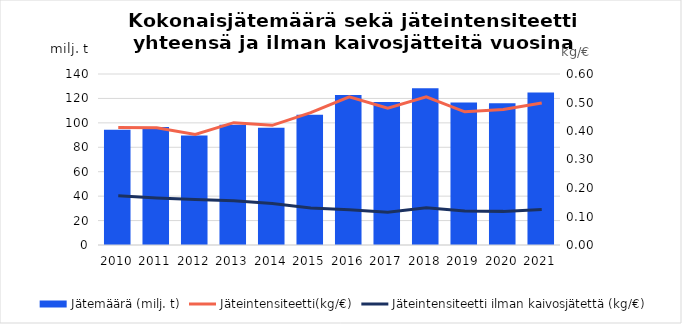
| Category | Jätemäärä (milj. t) |
|---|---|
| 2010.0 | 94.33 |
| 2011.0 | 96.595 |
| 2012.0 | 89.738 |
| 2013.0 | 98.472 |
| 2014.0 | 95.97 |
| 2015.0 | 106.709 |
| 2016.0 | 122.869 |
| 2017.0 | 117.069 |
| 2018.0 | 128.252 |
| 2019.0 | 116.63 |
| 2020.0 | 115.995 |
| 2021.0 | 124.84 |